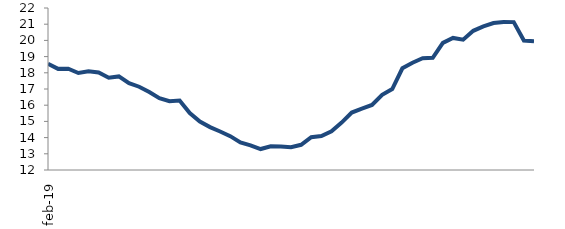
| Category | Series 0 |
|---|---|
| 2019-02-01 | 18.557 |
| 2019-03-01 | 18.243 |
| 2019-04-01 | 18.254 |
| 2019-05-01 | 17.988 |
| 2019-06-01 | 18.089 |
| 2019-07-01 | 18.02 |
| 2019-08-01 | 17.694 |
| 2019-09-01 | 17.777 |
| 2019-10-01 | 17.36 |
| 2019-11-01 | 17.14 |
| 2019-12-01 | 16.808 |
| 2020-01-01 | 16.434 |
| 2020-02-01 | 16.25 |
| 2020-03-01 | 16.293 |
| 2020-04-01 | 15.517 |
| 2020-05-01 | 14.987 |
| 2020-06-01 | 14.648 |
| 2020-07-01 | 14.379 |
| 2020-08-01 | 14.088 |
| 2020-09-01 | 13.698 |
| 2020-10-01 | 13.522 |
| 2020-11-01 | 13.294 |
| 2020-12-01 | 13.469 |
| 2021-01-01 | 13.453 |
| 2021-02-01 | 13.409 |
| 2021-03-01 | 13.556 |
| 2021-04-01 | 14.027 |
| 2021-05-01 | 14.092 |
| 2021-06-01 | 14.388 |
| 2021-07-01 | 14.927 |
| 2021-08-01 | 15.546 |
| 2021-09-01 | 15.791 |
| 2021-10-01 | 16.017 |
| 2021-11-01 | 16.641 |
| 2021-12-01 | 16.998 |
| 2022-01-01 | 18.278 |
| 2022-02-01 | 18.625 |
| 2022-03-01 | 18.903 |
| 2022-04-01 | 18.924 |
| 2022-05-01 | 19.85 |
| 2022-06-01 | 20.151 |
| 2022-07-01 | 20.044 |
| 2022-08-01 | 20.593 |
| 2022-09-01 | 20.866 |
| 2022-10-01 | 21.074 |
| 2022-11-01 | 21.136 |
| 2022-12-01 | 21.129 |
| 2023-01-01 | 19.993 |
| 2023-02-01 | 19.949 |